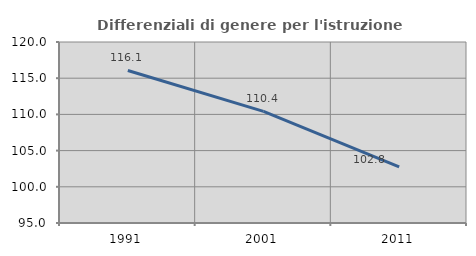
| Category | Differenziali di genere per l'istruzione superiore |
|---|---|
| 1991.0 | 116.066 |
| 2001.0 | 110.422 |
| 2011.0 | 102.761 |